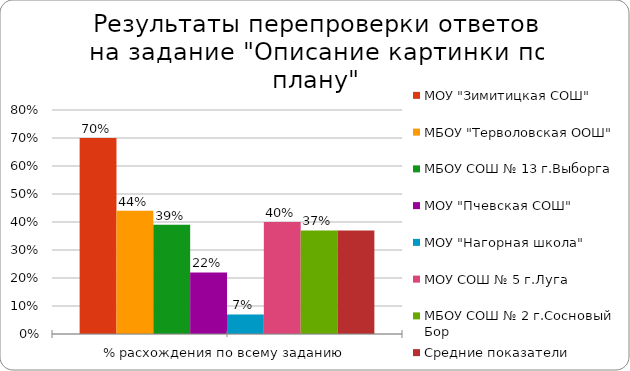
| Category | МОУ "Зимитицкая СОШ" | МБОУ "Терволовская ООШ" | МБОУ СОШ № 13 г.Выборга | МОУ "Пчевская СОШ" | МОУ "Нагорная школа" | МОУ СОШ № 5 г.Луга | МБОУ СОШ № 2 г.Сосновый Бор | Средние показатели  |
|---|---|---|---|---|---|---|---|---|
| % расхождения по всему заданию | 0.7 | 0.44 | 0.39 | 0.22 | 0.07 | 0.4 | 0.37 | 0.37 |